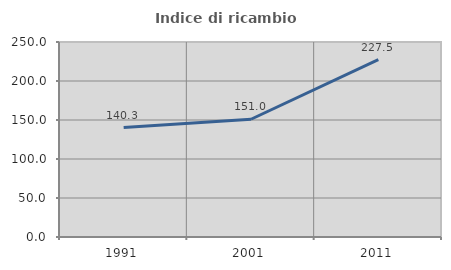
| Category | Indice di ricambio occupazionale  |
|---|---|
| 1991.0 | 140.323 |
| 2001.0 | 150.98 |
| 2011.0 | 227.5 |